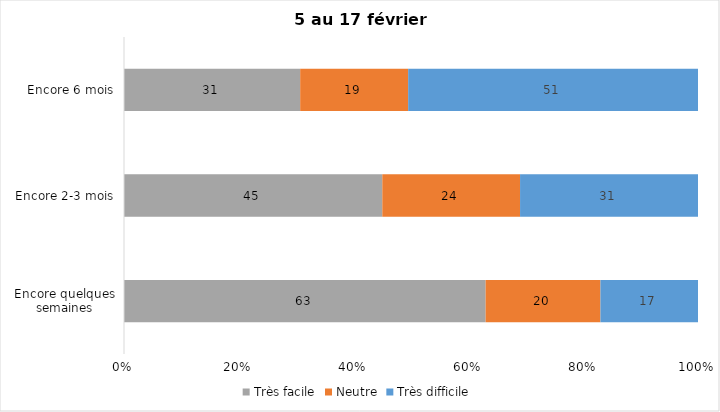
| Category | Très facile | Neutre | Très difficile |
|---|---|---|---|
| Encore quelques semaines | 63 | 20 | 17 |
| Encore 2-3 mois | 45 | 24 | 31 |
| Encore 6 mois | 31 | 19 | 51 |